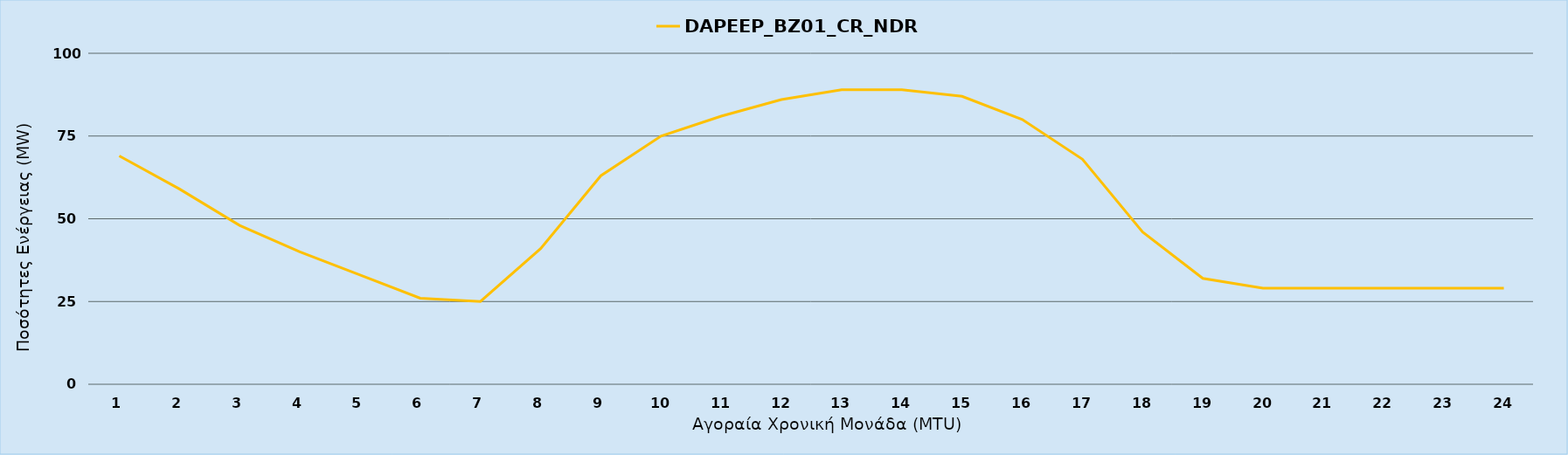
| Category | DAPEEP_BZ01_CR_NDR |
|---|---|
| 0 | 69 |
| 1 | 59 |
| 2 | 48 |
| 3 | 40 |
| 4 | 33 |
| 5 | 26 |
| 6 | 25 |
| 7 | 41 |
| 8 | 63 |
| 9 | 75 |
| 10 | 81 |
| 11 | 86 |
| 12 | 89 |
| 13 | 89 |
| 14 | 87 |
| 15 | 80 |
| 16 | 68 |
| 17 | 46 |
| 18 | 32 |
| 19 | 29 |
| 20 | 29 |
| 21 | 29 |
| 22 | 29 |
| 23 | 29 |